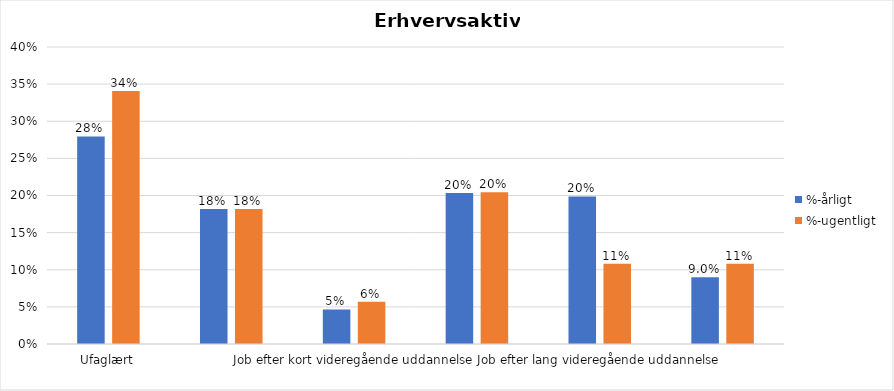
| Category | %-årligt | %-ugentligt |
|---|---|---|
| Ufaglært | 0.28 | 0.341 |
| Erhvervsfagligt job | 0.182 | 0.182 |
| Job efter kort videregående uddannelse | 0.047 | 0.057 |
| Job efter mellemlang videregående uddannelse | 0.203 | 0.205 |
| Job efter lang videregående uddannelse | 0.199 | 0.108 |
| Selvstændig | 0.09 | 0.108 |